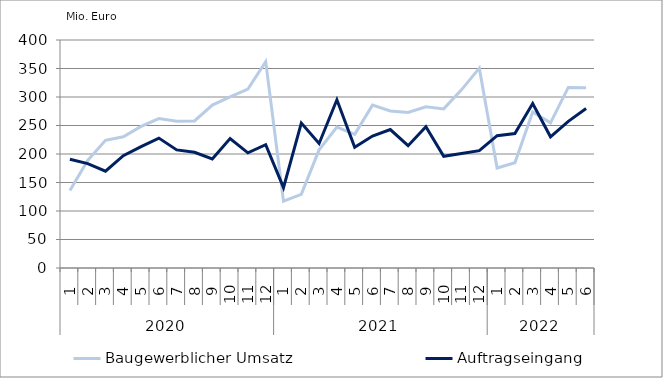
| Category | Baugewerblicher Umsatz | Auftragseingang |
|---|---|---|
| 0 | 136135.432 | 190647.086 |
| 1 | 188682.361 | 183141.14 |
| 2 | 224009.315 | 169770.009 |
| 3 | 230172.252 | 196979.845 |
| 4 | 248410.714 | 212955.83 |
| 5 | 262078.128 | 227853.487 |
| 6 | 257360.37 | 207209.188 |
| 7 | 257932.168 | 202976.091 |
| 8 | 285866.269 | 191463.844 |
| 9 | 300164.57 | 227245.467 |
| 10 | 313922.518 | 202060.636 |
| 11 | 362040.738 | 216296.504 |
| 12 | 117421.805 | 141020.655 |
| 13 | 129162.55 | 254416.876 |
| 14 | 207280.837 | 218451.405 |
| 15 | 247094.279 | 295077.868 |
| 16 | 234515.312 | 211696.129 |
| 17 | 285732.845 | 231455.155 |
| 18 | 275480.885 | 242932.505 |
| 19 | 272787.524 | 214636.944 |
| 20 | 282850.254 | 247827.991 |
| 21 | 279173.21 | 196069.238 |
| 22 | 312511.437 | 201015.897 |
| 23 | 350582.01 | 205949.991 |
| 24 | 175456.852 | 232178.255 |
| 25 | 184578.32 | 236006.862 |
| 26 | 273732.567 | 288451.109 |
| 27 | 254683.671 | 230228.968 |
| 28 | 316794.568 | 257235.39 |
| 29 | 316277.567 | 279900.179 |